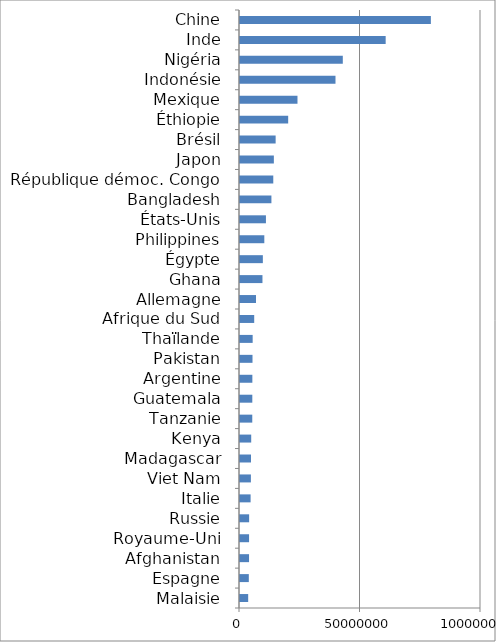
| Category | Series 0 |
|---|---|
| Malaisie | 3393157.2 |
| Espagne | 3659292.999 |
| Afghanistan | 3752909.071 |
| Royaume-Uni | 3762385.619 |
| Russie | 3790065.846 |
| Italie | 4402543.271 |
| Viet Nam | 4521683.702 |
| Madagascar | 4562414.654 |
| Kenya | 4649544.823 |
| Tanzanie | 5092179.874 |
| Guatemala | 5108266.868 |
| Argentine | 5128332.176 |
| Pakistan | 5186340.579 |
| Thaïlande | 5252757.368 |
| Afrique du Sud | 5893807.167 |
| Allemagne | 6644626.78 |
| Ghana | 9320381.917 |
| Égypte | 9481230.354 |
| Philippines | 10090403.407 |
| États-Unis | 10763413.132 |
| Bangladesh | 13035082.364 |
| République démoc. Congo | 13809395.097 |
| Japon | 14049105.339 |
| Brésil | 14787858.959 |
| Éthiopie | 19991830.348 |
| Mexique | 23851941.803 |
| Indonésie | 39622610.223 |
| Nigéria | 42656782.096 |
| Inde | 60441718.521 |
| Chine | 79199934.579 |